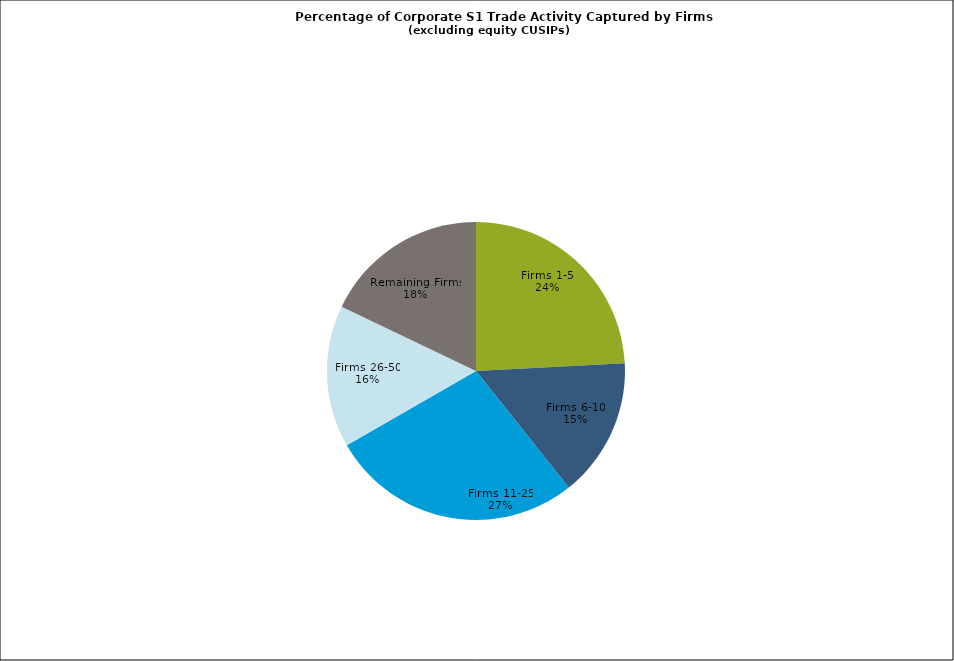
| Category | Series 0 |
|---|---|
| Firms 1-5 | 0.242 |
| Firms 6-10 | 0.151 |
| Firms 11-25 | 0.274 |
| Firms 26-50 | 0.154 |
| Remaining Firms | 0.179 |